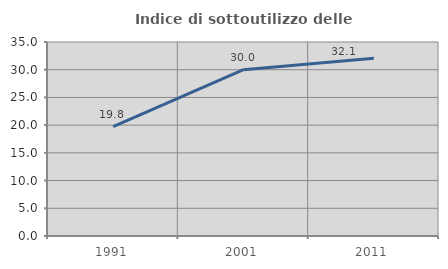
| Category | Indice di sottoutilizzo delle abitazioni  |
|---|---|
| 1991.0 | 19.753 |
| 2001.0 | 30 |
| 2011.0 | 32.082 |